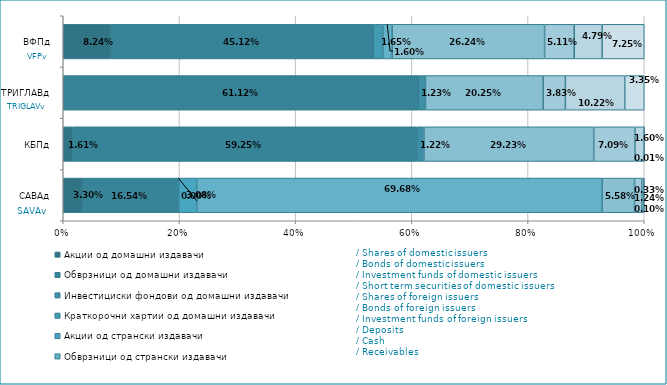
| Category | Акции од домашни издавачи  | Обврзници од домашни издавачи  | Инвестициски фондови од домашни издавачи   | Краткорочни хартии од домашни издавачи   | Акции од странски издавачи   | Обврзници од странски издавачи  | Инвестициски фондови од странски издавaчи  | Депозити | Парични средства | Побарувања |
|---|---|---|---|---|---|---|---|---|---|---|
| САВАд | 0.033 | 0.165 | 0 | 0 | 0.031 | 0.697 | 0.056 | 0.012 | 0.003 | 0.001 |
| КБПд | 0.016 | 0.593 | 0.012 | 0 | 0 | 0 | 0.292 | 0.071 | 0.016 | 0 |
| ТРИГЛАВд | 0 | 0.611 | 0.012 | 0 | 0 | 0 | 0.203 | 0.038 | 0.102 | 0.034 |
| ВФПд | 0.082 | 0.451 | 0 | 0.016 | 0 | 0.016 | 0.262 | 0.051 | 0.048 | 0.073 |